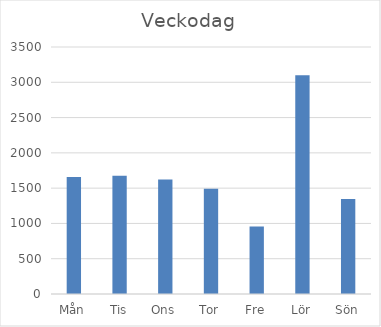
| Category | Summa |
|---|---|
| Mån | 1658 |
| Tis | 1677 |
| Ons | 1622 |
| Tor | 1490 |
| Fre | 957 |
| Lör | 3099 |
| Sön | 1346 |